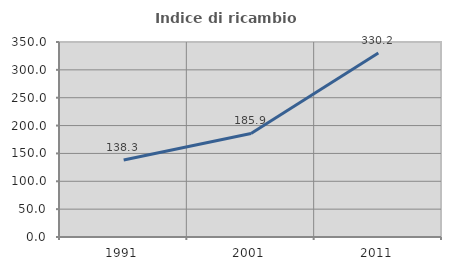
| Category | Indice di ricambio occupazionale  |
|---|---|
| 1991.0 | 138.281 |
| 2001.0 | 185.87 |
| 2011.0 | 330.159 |